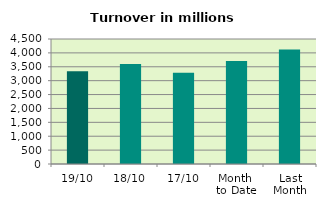
| Category | Series 0 |
|---|---|
| 19/10 | 3335.652 |
| 18/10 | 3599.674 |
| 17/10 | 3283.227 |
| Month 
to Date | 3703.516 |
| Last
Month | 4119.728 |